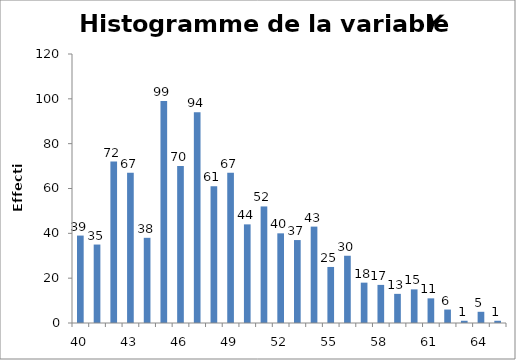
| Category | Fréquence |
|---|---|
| 40.0 | 39 |
| 41.0 | 35 |
| 42.0 | 72 |
| 43.0 | 67 |
| 44.0 | 38 |
| 45.0 | 99 |
| 46.0 | 70 |
| 47.0 | 94 |
| 48.0 | 61 |
| 49.0 | 67 |
| 50.0 | 44 |
| 51.0 | 52 |
| 52.0 | 40 |
| 53.0 | 37 |
| 54.0 | 43 |
| 55.0 | 25 |
| 56.0 | 30 |
| 57.0 | 18 |
| 58.0 | 17 |
| 59.0 | 13 |
| 60.0 | 15 |
| 61.0 | 11 |
| 62.0 | 6 |
| 63.0 | 1 |
| 64.0 | 5 |
| 65.0 | 1 |